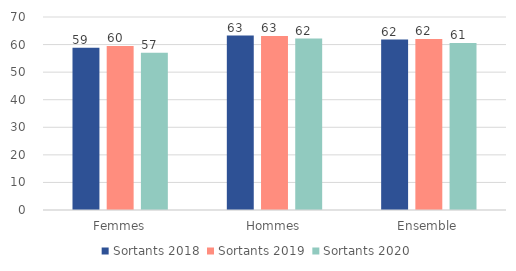
| Category | Sortants 2018 | Sortants 2019 | Sortants 2020 |
|---|---|---|---|
| Femmes | 58.88 | 59.51 | 57 |
| Hommes | 63.26 | 63.14 | 62.19 |
| Ensemble | 61.82 | 61.98 | 60.54 |